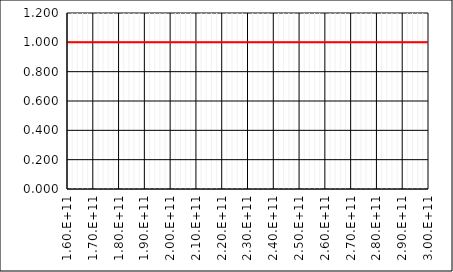
| Category | Series 0 |
|---|---|
| 160000000000.0 | 1 |
| 162000000000.0 | 1 |
| 164000000000.0 | 1 |
| 166000000000.0 | 1 |
| 168000000000.0 | 1 |
| 170000000000.0 | 1 |
| 172000000000.0 | 1 |
| 174000000000.0 | 1 |
| 176000000000.0 | 1 |
| 178000000000.0 | 1 |
| 180000000000.0 | 1 |
| 182000000000.0 | 1 |
| 184000000000.0 | 1 |
| 186000000000.0 | 1 |
| 188000000000.0 | 1 |
| 190000000000.0 | 1 |
| 192000000000.0 | 1 |
| 194000000000.0 | 1 |
| 196000000000.0 | 1 |
| 198000000000.0 | 1 |
| 200000000000.0 | 1 |
| 202000000000.0 | 1 |
| 204000000000.0 | 1 |
| 206000000000.0 | 1 |
| 208000000000.0 | 1 |
| 210000000000.0 | 1 |
| 212000000000.0 | 1 |
| 214000000000.0 | 1 |
| 216000000000.0 | 1 |
| 218000000000.0 | 1 |
| 220000000000.0 | 1 |
| 222000000000.0 | 1 |
| 224000000000.0 | 1 |
| 226000000000.0 | 1 |
| 228000000000.0 | 1 |
| 230000000000.0 | 1 |
| 232000000000.0 | 1 |
| 234000000000.0 | 1 |
| 236000000000.0 | 1 |
| 238000000000.0 | 1 |
| 240000000000.0 | 1 |
| 242000000000.0 | 1 |
| 244000000000.0 | 1 |
| 246000000000.0 | 1 |
| 248000000000.0 | 1 |
| 250000000000.0 | 1 |
| 252000000000.0 | 1 |
| 254000000000.0 | 1 |
| 256000000000.0 | 1 |
| 258000000000.0 | 1 |
| 260000000000.0 | 1 |
| 262000000000.0 | 1 |
| 264000000000.0 | 1 |
| 266000000000.0 | 1 |
| 268000000000.0 | 1 |
| 270000000000.0 | 1 |
| 272000000000.0 | 1 |
| 274000000000.0 | 1 |
| 276000000000.0 | 1 |
| 278000000000.0 | 1 |
| 280000000000.0 | 1 |
| 282000000000.0 | 1 |
| 284000000000.0 | 1 |
| 286000000000.0 | 1 |
| 288000000000.0 | 1 |
| 290000000000.0 | 1 |
| 292000000000.0 | 1 |
| 294000000000.0 | 1 |
| 296000000000.0 | 1 |
| 298000000000.0 | 1 |
| 300000000000.0 | 1 |